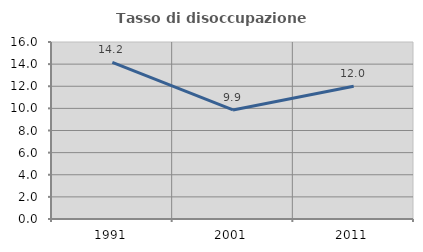
| Category | Tasso di disoccupazione giovanile  |
|---|---|
| 1991.0 | 14.151 |
| 2001.0 | 9.859 |
| 2011.0 | 12 |